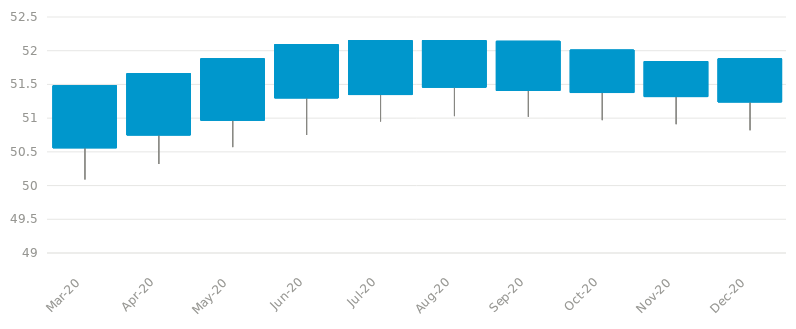
| Category | Series 0 | Series 1 | Series 2 |
|---|---|---|---|
| Mar-20 | 51.48 | 50.09 | 50.56 |
| Apr-20 | 51.66 | 50.32 | 50.75 |
| May-20 | 51.88 | 50.57 | 50.97 |
| Jun-20 | 52.09 | 50.75 | 51.3 |
| Jul-20 | 52.15 | 50.95 | 51.35 |
| Aug-20 | 52.15 | 51.03 | 51.46 |
| Sep-20 | 52.14 | 51.02 | 51.41 |
| Oct-20 | 52.01 | 50.97 | 51.38 |
| Nov-20 | 51.84 | 50.91 | 51.32 |
| Dec-20 | 51.88 | 50.82 | 51.24 |